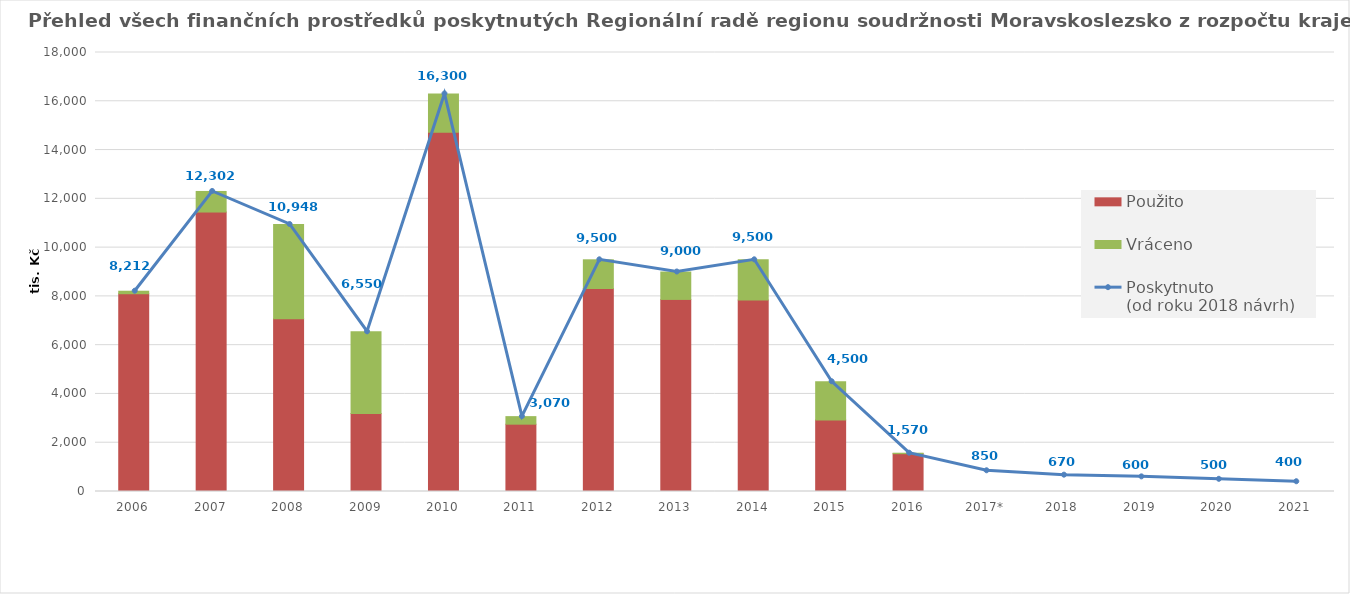
| Category | Použito | Vráceno |
|---|---|---|
| 2006 | 8108.8 | 103.2 |
| 2007 | 11458.5 | 843.5 |
| 2008 | 7085.985 | 3862.015 |
| 2009 | 3195.292 | 3354.708 |
| 2010 | 14731.365 | 1568.635 |
| 2011 | 2760.6 | 309.4 |
| 2012 | 8323.226 | 1176.774 |
| 2013 | 7875.606 | 1124.394 |
| 2014 | 7850.142 | 1649.858 |
| 2015 | 2936.676 | 1563.324 |
| 2016 | 1550.789 | 19.211 |
| 2017* | 0 | 0 |
| 2018 | 0 | 0 |
| 2019 | 0 | 0 |
| 2020 | 0 | 0 |
| 2021 | 0 | 0 |